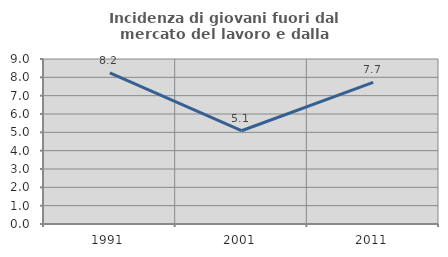
| Category | Incidenza di giovani fuori dal mercato del lavoro e dalla formazione  |
|---|---|
| 1991.0 | 8.242 |
| 2001.0 | 5.087 |
| 2011.0 | 7.728 |